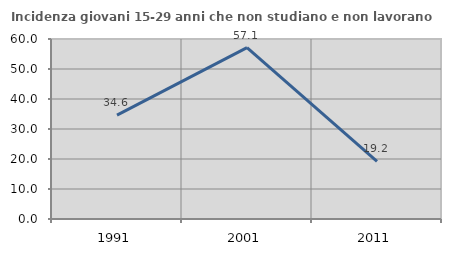
| Category | Incidenza giovani 15-29 anni che non studiano e non lavorano  |
|---|---|
| 1991.0 | 34.629 |
| 2001.0 | 57.143 |
| 2011.0 | 19.231 |